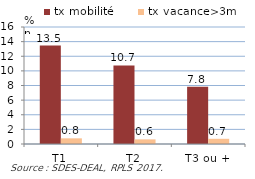
| Category | tx mobilité | tx vacance>3m |
|---|---|---|
| T1 | 13.455 | 0.774 |
| T2 | 10.737 | 0.632 |
| T3 ou + | 7.832 | 0.71 |